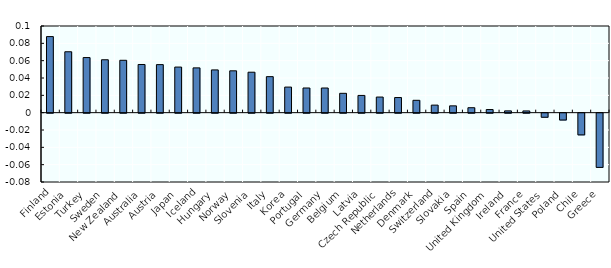
| Category | Change in CV - Working-age population |
|---|---|
| Finland | 0.088 |
| Estonia | 0.07 |
| Turkey | 0.064 |
| Sweden | 0.061 |
| New Zealand | 0.06 |
| Australia | 0.056 |
| Austria | 0.055 |
| Japan | 0.053 |
| Iceland | 0.052 |
| Hungary | 0.049 |
| Norway | 0.048 |
| Slovenia | 0.047 |
| Italy | 0.042 |
| Korea | 0.03 |
| Portugal | 0.028 |
| Germany | 0.028 |
| Belgium | 0.022 |
| Latvia | 0.02 |
| Czech Republic | 0.018 |
| Netherlands | 0.017 |
| Denmark | 0.014 |
| Switzerland | 0.009 |
| Slovakia | 0.008 |
| Spain | 0.006 |
| United Kingdom | 0.004 |
| Ireland | 0.002 |
| France | 0.002 |
| United States | -0.005 |
| Poland | -0.008 |
| Chile | -0.025 |
| Greece | -0.063 |